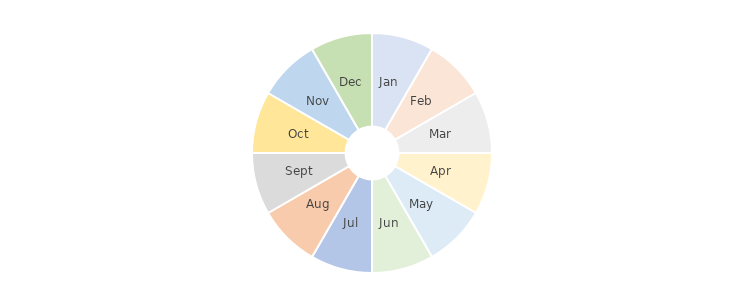
| Category | Series 0 |
|---|---|
| 43466.0 | 1 |
| 43497.0 | 1 |
| 43525.0 | 1 |
| 43556.0 | 1 |
| 43586.0 | 1 |
| 43617.0 | 1 |
| 43647.0 | 1 |
| 43678.0 | 1 |
| 43709.0 | 1 |
| 43739.0 | 1 |
| 43770.0 | 1 |
| 43800.0 | 1 |